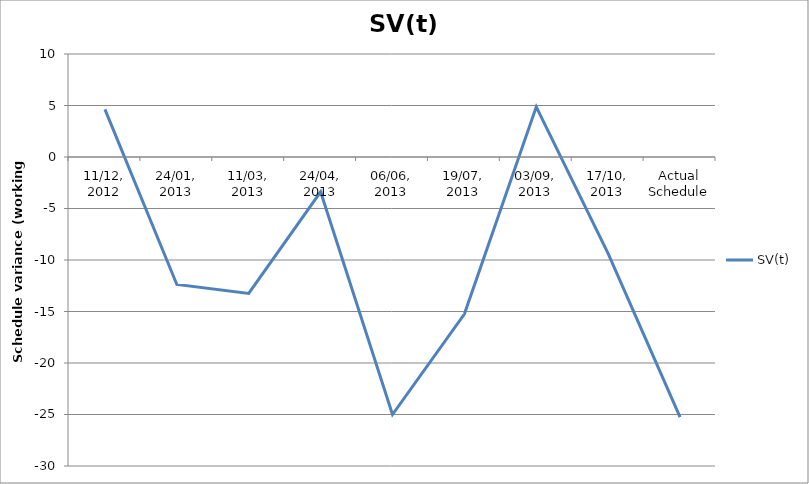
| Category | SV(t) |
|---|---|
| 11/12, 2012 | 4.625 |
| 24/01, 2013 | -12.375 |
| 11/03, 2013 | -13.25 |
| 24/04, 2013 | -3.375 |
| 06/06, 2013 | -25 |
| 19/07, 2013 | -15.25 |
| 03/09, 2013 | 4.875 |
| 17/10, 2013 | -9.375 |
| Actual Schedule | -25.25 |